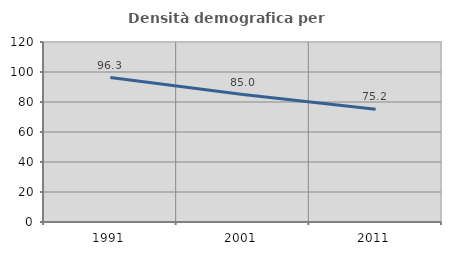
| Category | Densità demografica |
|---|---|
| 1991.0 | 96.317 |
| 2001.0 | 84.967 |
| 2011.0 | 75.177 |